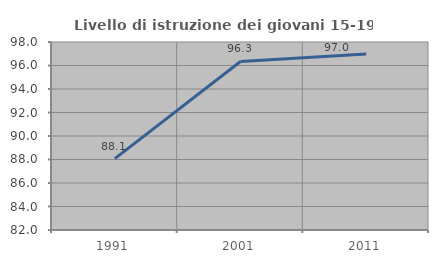
| Category | Livello di istruzione dei giovani 15-19 anni |
|---|---|
| 1991.0 | 88.073 |
| 2001.0 | 96.341 |
| 2011.0 | 96.97 |